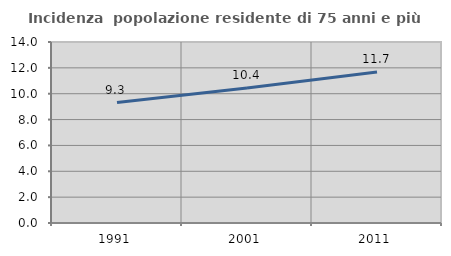
| Category | Incidenza  popolazione residente di 75 anni e più |
|---|---|
| 1991.0 | 9.319 |
| 2001.0 | 10.442 |
| 2011.0 | 11.685 |